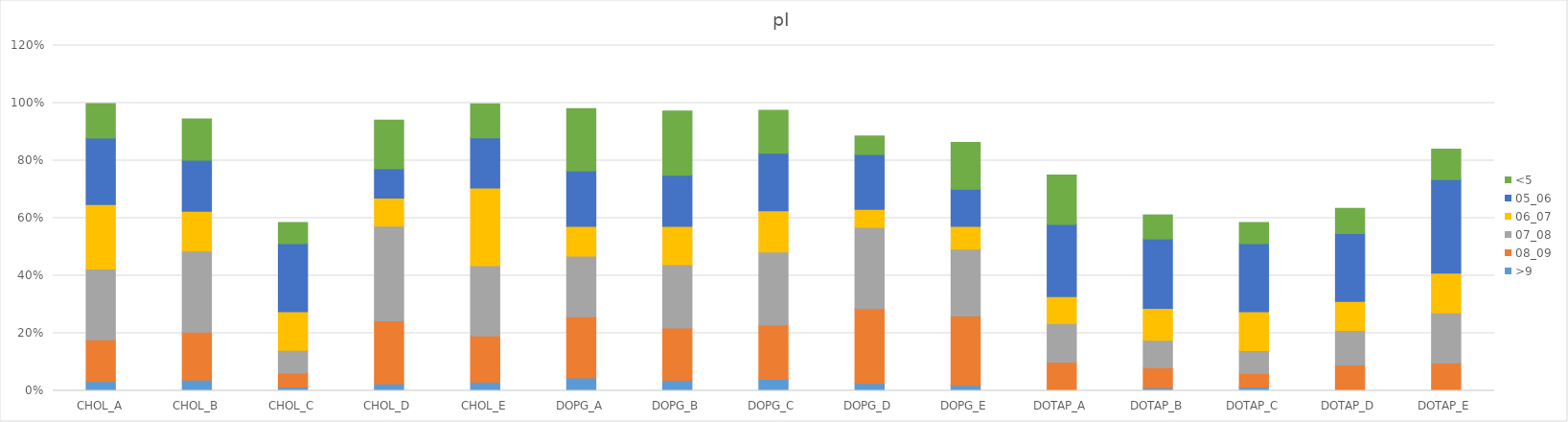
| Category | >9 | 08_09 | 07_08 | 06_07 | 05_06 | <5 |
|---|---|---|---|---|---|---|
| CHOL_A | 0.033 | 0.144 | 0.246 | 0.224 | 0.231 | 0.121 |
| CHOL_B | 0.038 | 0.166 | 0.282 | 0.138 | 0.177 | 0.144 |
| CHOL_C | 0.014 | 0.048 | 0.079 | 0.135 | 0.236 | 0.074 |
| CHOL_D | 0.024 | 0.219 | 0.329 | 0.097 | 0.102 | 0.169 |
| CHOL_E | 0.03 | 0.16 | 0.244 | 0.27 | 0.174 | 0.118 |
| DOPG_A | 0.045 | 0.212 | 0.211 | 0.103 | 0.192 | 0.217 |
| DOPG_B | 0.037 | 0.181 | 0.22 | 0.133 | 0.178 | 0.223 |
| DOPG_C | 0.04 | 0.189 | 0.254 | 0.143 | 0.2 | 0.149 |
| DOPG_D | 0.026 | 0.26 | 0.282 | 0.063 | 0.19 | 0.064 |
| DOPG_E | 0.019 | 0.241 | 0.232 | 0.079 | 0.129 | 0.163 |
| DOTAP_A | 0 | 0.099 | 0.135 | 0.093 | 0.251 | 0.171 |
| DOTAP_B | 0.011 | 0.069 | 0.096 | 0.111 | 0.241 | 0.084 |
| DOTAP_C | 0.014 | 0.047 | 0.079 | 0.135 | 0.236 | 0.074 |
| DOTAP_D | 0 | 0.09 | 0.119 | 0.102 | 0.235 | 0.087 |
| DOTAP_E | 0 | 0.097 | 0.174 | 0.138 | 0.325 | 0.106 |